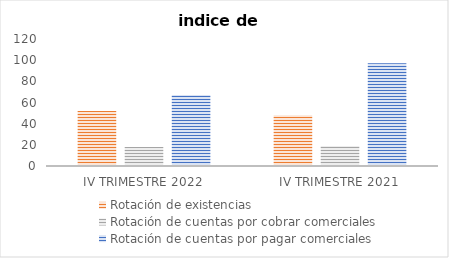
| Category | Rotación de existencias | Rotación de cuentas por cobrar comerciales | Rotación de cuentas por pagar comerciales |
|---|---|---|---|
| IV TRIMESTRE 2022 | 52 | 18 | 67 |
| IV TRIMESTRE 2021 | 48 | 19 | 97 |